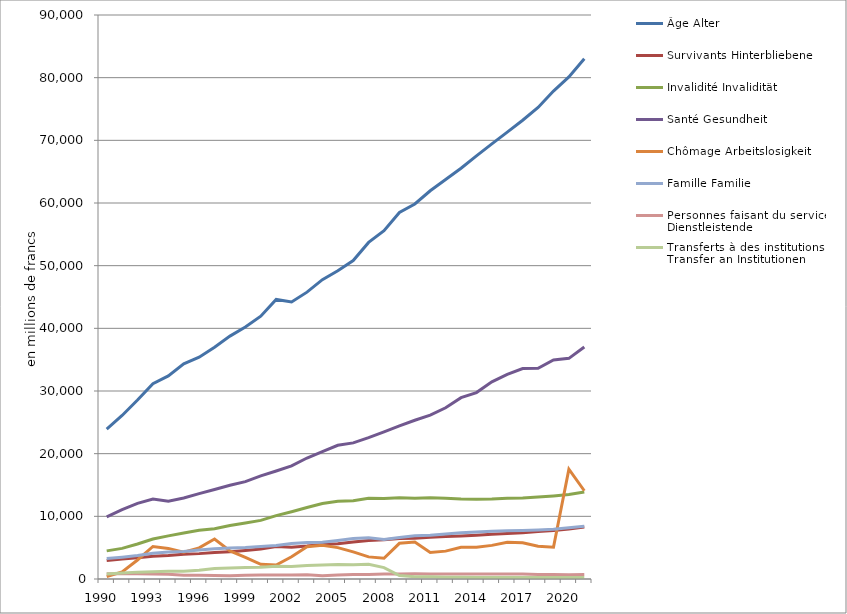
| Category | Âge | Survivants | Invalidité | Santé | Chômage | Famille | Personnes faisant du service | Transferts à des institutions |
|---|---|---|---|---|---|---|---|---|
| 1990.0 | 23929.721 | 2970.348 | 4490.079 | 9922.682 | 372.024 | 3282.888 | 839.892 | 782.31 |
| 1991.0 | 26092.971 | 3208.369 | 4889.562 | 11064.237 | 1135.204 | 3488.895 | 844.113 | 946.584 |
| 1992.0 | 28570.274 | 3378.569 | 5585.933 | 12061.25 | 3034.027 | 3740.249 | 841.09 | 1096.751 |
| 1993.0 | 31173.679 | 3627.011 | 6376.61 | 12755.347 | 5189.796 | 4123.171 | 782.824 | 1148.433 |
| 1994.0 | 32404.441 | 3733.402 | 6880.254 | 12420.753 | 4883.831 | 4298.034 | 763.011 | 1224.641 |
| 1995.0 | 34329.524 | 3963.268 | 7352.311 | 12922.405 | 4279.144 | 4401.543 | 582.239 | 1252.478 |
| 1996.0 | 35386.129 | 4049.045 | 7764.301 | 13618.173 | 4959.94 | 4615.289 | 582.889 | 1405.207 |
| 1997.0 | 36993.81 | 4220.51 | 8009.389 | 14282.769 | 6387.4 | 4819.694 | 545.833 | 1676.931 |
| 1998.0 | 38755.29 | 4363.207 | 8536.734 | 14947.767 | 4479.8 | 4949.667 | 522.436 | 1750.712 |
| 1999.0 | 40201.051 | 4554.743 | 8942.651 | 15537.703 | 3457.1 | 5032.687 | 591.754 | 1838.938 |
| 2000.0 | 41934.3 | 4775.471 | 9354.01 | 16459.022 | 2348.8 | 5180.535 | 638.251 | 1866.811 |
| 2001.0 | 44611.288 | 5169.202 | 10121.648 | 17239.364 | 2227.5 | 5350.275 | 650.226 | 2042.001 |
| 2002.0 | 44210.302 | 5069.178 | 10743.155 | 18050.017 | 3551.2 | 5648.966 | 649.142 | 2005.906 |
| 2003.0 | 45775.202 | 5250.545 | 11399.164 | 19303.111 | 5141.4 | 5839.322 | 660.652 | 2144.844 |
| 2004.0 | 47762.14 | 5491.778 | 12037.638 | 20333.063 | 5377.2 | 5871.667 | 512.373 | 2237.251 |
| 2005.0 | 49199.348 | 5635.013 | 12417.706 | 21339.897 | 5010.8 | 6159.069 | 624.578 | 2298.748 |
| 2006.0 | 50811.345 | 5905.641 | 12482.458 | 21724.477 | 4337.6 | 6477.335 | 726.46 | 2257.388 |
| 2007.0 | 53707.564 | 6140.679 | 12868.987 | 22561.7 | 3529.9 | 6586.521 | 723.433 | 2337.604 |
| 2008.0 | 55585.683 | 6252.099 | 12833.127 | 23483.432 | 3309.938 | 6316.423 | 778.517 | 1823.014 |
| 2009.0 | 58490.25 | 6468.319 | 12961.999 | 24433.521 | 5694.499 | 6623.055 | 806.282 | 540.017 |
| 2010.0 | 59845.708 | 6519.1 | 12874.664 | 25332.711 | 5884.59 | 6900.033 | 826.877 | 346.769 |
| 2011.0 | 61956.813 | 6657.991 | 12961.663 | 26161.738 | 4217.221 | 6968.882 | 806.27 | 341.883 |
| 2012.0 | 63740.595 | 6787.947 | 12870.333 | 27327.053 | 4447.518 | 7164.949 | 803.364 | 281.494 |
| 2013.0 | 65550.375 | 6866.034 | 12762.733 | 28933.83 | 5049.488 | 7373.649 | 805.308 | 265.266 |
| 2014.0 | 67522.982 | 6974.15 | 12744.96 | 29746.638 | 5059.886 | 7496.629 | 795.7 | 259.099 |
| 2015.0 | 69442.178 | 7135.871 | 12758.419 | 31459.801 | 5363.302 | 7628.96 | 809.84 | 250.849 |
| 2016.0 | 71312.773 | 7255.16 | 12873.488 | 32653.544 | 5866.655 | 7685.911 | 806.526 | 246.624 |
| 2017.0 | 73206.262 | 7396.707 | 12928.455 | 33585.557 | 5767.783 | 7750.623 | 799.961 | 255.841 |
| 2018.0 | 75241.616 | 7564.256 | 13073.808 | 33629.591 | 5213.194 | 7829.713 | 730.323 | 252.592 |
| 2019.0 | 77859.338 | 7739.286 | 13261.468 | 34953.316 | 5076.676 | 7947.629 | 729.9 | 255.147 |
| 2020.0 | 80121.868 | 7976.853 | 13471.756 | 35208.49 | 17525.129 | 8174.177 | 676.13 | 255.141 |
| 2021.0 | 83028.16 | 8311.358 | 13871.747 | 37030.976 | 14082.614 | 8421.064 | 723.04 | 250.807 |